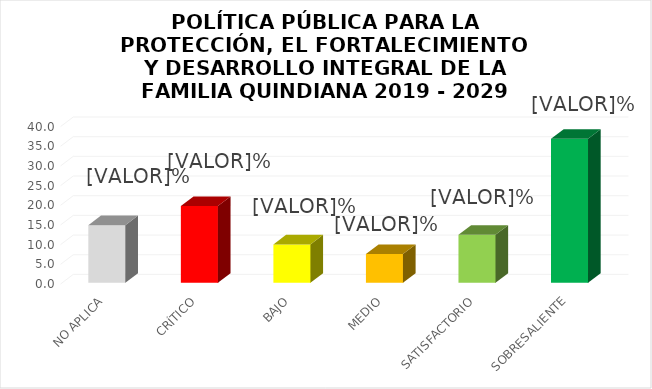
| Category | Series 0 |
|---|---|
| NO APLICA | 14.634 |
| CRÍTICO | 19.512 |
| BAJO | 9.756 |
| MEDIO | 7.317 |
| SATISFACTORIO | 12.195 |
| SOBRESALIENTE | 36.585 |